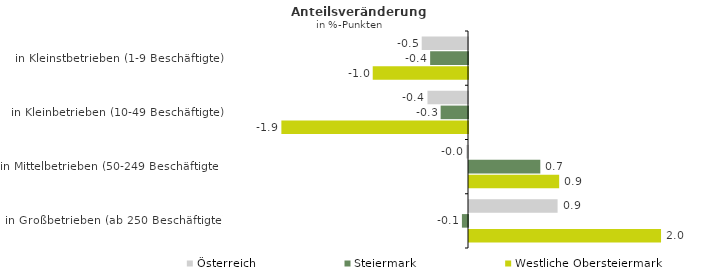
| Category | Österreich | Steiermark | Westliche Obersteiermark |
|---|---|---|---|
| in Kleinstbetrieben (1-9 Beschäftigte) | -0.48 | -0.393 | -0.988 |
| in Kleinbetrieben (10-49 Beschäftigte) | -0.42 | -0.284 | -1.936 |
| in Mittelbetrieben (50-249 Beschäftigte) | -0.019 | 0.74 | 0.935 |
| in Großbetrieben (ab 250 Beschäftigte) | 0.919 | -0.063 | 1.992 |